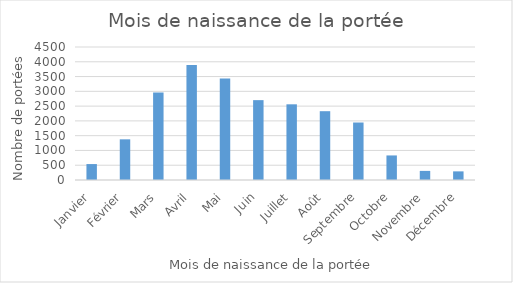
| Category | Series 0 |
|---|---|
| Janvier | 539 |
| Février | 1376 |
| Mars | 2960 |
| Avril | 3895 |
| Mai | 3432 |
| Juin | 2702 |
| Juillet | 2561 |
| Août | 2328 |
| Septembre | 1945 |
| Octobre | 831 |
| Novembre | 308 |
| Décembre | 292 |